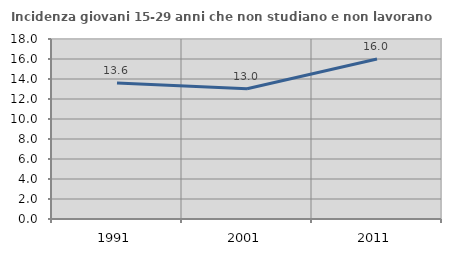
| Category | Incidenza giovani 15-29 anni che non studiano e non lavorano  |
|---|---|
| 1991.0 | 13.598 |
| 2001.0 | 13.033 |
| 2011.0 | 16 |